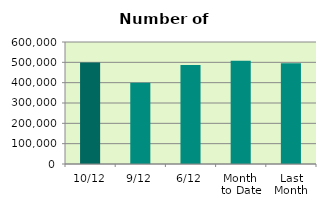
| Category | Series 0 |
|---|---|
| 10/12 | 499518 |
| 9/12 | 399446 |
| 6/12 | 487254 |
| Month 
to Date | 508295.714 |
| Last
Month | 495852.095 |